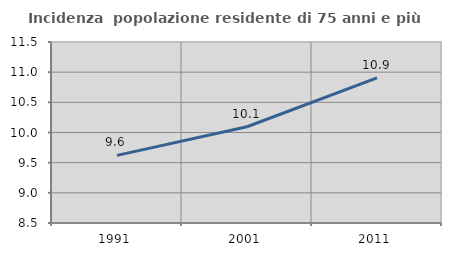
| Category | Incidenza  popolazione residente di 75 anni e più |
|---|---|
| 1991.0 | 9.621 |
| 2001.0 | 10.095 |
| 2011.0 | 10.907 |